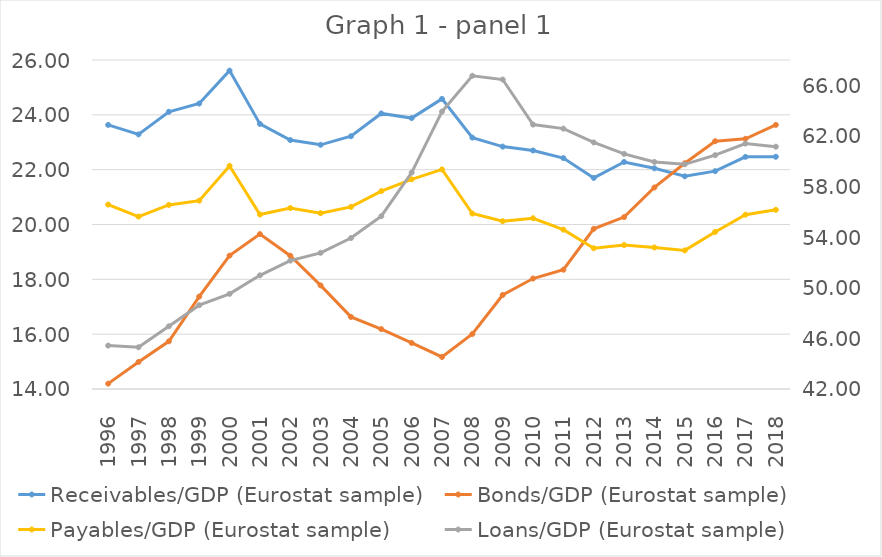
| Category | Receivables/GDP (Eurostat sample) | Bonds/GDP (Eurostat sample) | Payables/GDP (Eurostat sample) |
|---|---|---|---|
| 1996.0 | 23.633 | 14.195 | 20.728 |
| 1997.0 | 23.286 | 14.988 | 20.288 |
| 1998.0 | 24.112 | 15.739 | 20.714 |
| 1999.0 | 24.413 | 17.371 | 20.869 |
| 2000.0 | 25.612 | 18.866 | 22.137 |
| 2001.0 | 23.669 | 19.65 | 20.366 |
| 2002.0 | 23.079 | 18.861 | 20.601 |
| 2003.0 | 22.906 | 17.778 | 20.412 |
| 2004.0 | 23.219 | 16.63 | 20.642 |
| 2005.0 | 24.05 | 16.183 | 21.218 |
| 2006.0 | 23.881 | 15.68 | 21.649 |
| 2007.0 | 24.582 | 15.168 | 22.009 |
| 2008.0 | 23.17 | 16.006 | 20.4 |
| 2009.0 | 22.841 | 17.429 | 20.119 |
| 2010.0 | 22.699 | 18.029 | 20.229 |
| 2011.0 | 22.421 | 18.35 | 19.812 |
| 2012.0 | 21.698 | 19.841 | 19.134 |
| 2013.0 | 22.281 | 20.271 | 19.251 |
| 2014.0 | 22.05 | 21.352 | 19.162 |
| 2015.0 | 21.758 | 22.235 | 19.055 |
| 2016.0 | 21.945 | 23.037 | 19.729 |
| 2017.0 | 22.468 | 23.127 | 20.358 |
| 2018.0 | 22.471 | 23.633 | 20.537 |